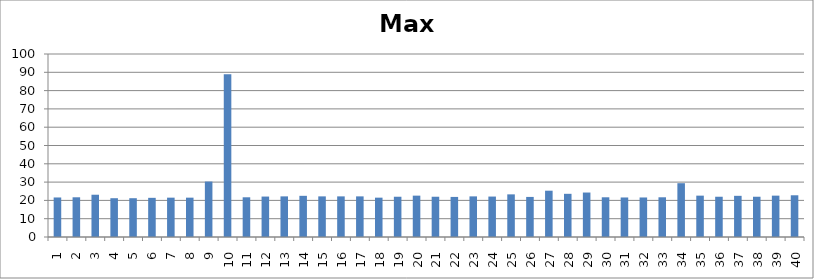
| Category | Max |
|---|---|
| 1.0 | 21.6 |
| 2.0 | 21.7 |
| 3.0 | 23.1 |
| 4.0 | 21.2 |
| 5.0 | 21.2 |
| 6.0 | 21.4 |
| 7.0 | 21.5 |
| 8.0 | 21.5 |
| 9.0 | 30.3 |
| 10.0 | 88.9 |
| 11.0 | 21.7 |
| 12.0 | 22.1 |
| 13.0 | 22.2 |
| 14.0 | 22.5 |
| 15.0 | 22.2 |
| 16.0 | 22.2 |
| 17.0 | 22.2 |
| 18.0 | 21.5 |
| 19.0 | 22 |
| 20.0 | 22.6 |
| 21.0 | 22 |
| 22.0 | 21.9 |
| 23.0 | 22.2 |
| 24.0 | 22.1 |
| 25.0 | 23.3 |
| 26.0 | 21.9 |
| 27.0 | 25.3 |
| 28.0 | 23.6 |
| 29.0 | 24.3 |
| 30.0 | 21.7 |
| 31.0 | 21.6 |
| 32.0 | 21.6 |
| 33.0 | 21.7 |
| 34.0 | 29.4 |
| 35.0 | 22.6 |
| 36.0 | 22 |
| 37.0 | 22.5 |
| 38.0 | 22 |
| 39.0 | 22.6 |
| 40.0 | 22.8 |